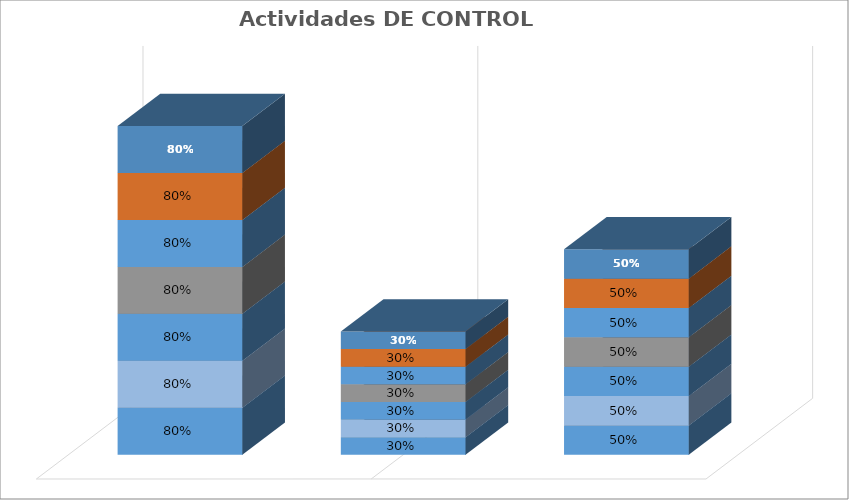
| Category | % Avance |
|---|---|
| 0 | 0.8 |
| 1 | 0.3 |
| 2 | 0.5 |